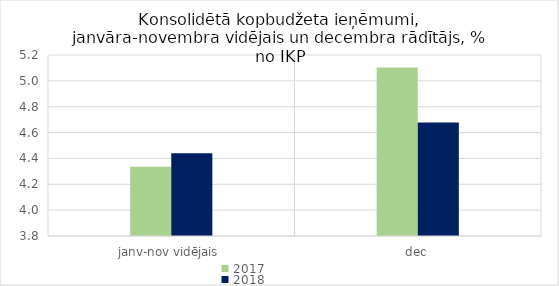
| Category | 2017 | 2018 |
|---|---|---|
| janv-nov vidējais | 4.336 | 4.44 |
| dec | 5.103 | 4.678 |